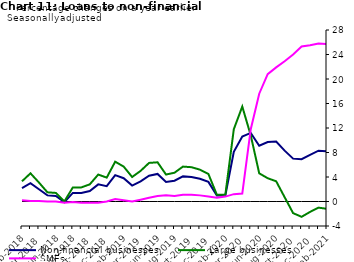
| Category | zero | Non-financial businesses | Large businesses | SMEs |
|---|---|---|---|---|
| Feb-2018 | 0 | 2.2 | 3.3 | 0.2 |
| Mar-2018 | 0 | 3 | 4.6 | 0.1 |
| Apr-2018 | 0 | 2 | 3.1 | 0.1 |
| May-2018 | 0 | 1 | 1.5 | 0 |
| Jun-2018 | 0 | 0.9 | 1.4 | 0 |
| Jul-2018 | 0 | -0.1 | 0 | -0.2 |
| Aug-2018 | 0 | 1.4 | 2.3 | -0.1 |
| Sep-2018 | 0 | 1.4 | 2.3 | -0.2 |
| Oct-2018 | 0 | 1.7 | 2.8 | -0.2 |
| Nov-2018 | 0 | 2.8 | 4.4 | -0.2 |
| Dec-2018 | 0 | 2.5 | 3.9 | 0 |
| Jan-2019 | 0 | 4.3 | 6.5 | 0.4 |
| Feb-2019 | 0 | 3.8 | 5.7 | 0.2 |
| Mar-2019 | 0 | 2.6 | 4 | 0 |
| Apr-2019 | 0 | 3.3 | 5 | 0.3 |
| May-2019 | 0 | 4.2 | 6.3 | 0.6 |
| Jun-2019 | 0 | 4.5 | 6.4 | 0.9 |
| Jul-2019 | 0 | 3.2 | 4.4 | 1 |
| Aug-2019 | 0 | 3.4 | 4.7 | 0.9 |
| Sep-2019 | 0 | 4.1 | 5.7 | 1.1 |
| Oct-2019 | 0 | 4 | 5.6 | 1.1 |
| Nov-2019 | 0 | 3.7 | 5.2 | 1 |
| Dec-2019 | 0 | 3.2 | 4.5 | 0.8 |
| Jan-2020 | 0 | 1 | 1.1 | 0.6 |
| Feb-2020 | 0 | 1 | 1.1 | 0.8 |
| Mar-2020 | 0 | 8.1 | 11.8 | 1.2 |
| Apr-2020 | 0 | 10.6 | 15.5 | 1.3 |
| May-2020 | 0 | 11.2 | 10.8 | 11.8 |
| Jun-2020 | 0 | 9.1 | 4.6 | 17.6 |
| Jul-2020 | 0 | 9.7 | 3.8 | 20.8 |
| Aug-2020 | 0 | 9.8 | 3.3 | 21.9 |
| Sep-2020 | 0 | 8.3 | 0.7 | 22.9 |
| Oct-2020 | 0 | 7 | -1.9 | 24 |
| Nov-2020 | 0 | 6.9 | -2.5 | 25.3 |
| Dec-2020 | 0 | 7.6 | -1.7 | 25.5 |
| Jan-2021 | 0 | 8.3 | -1 | 25.8 |
| Feb-2021 | 0 | 8.2 | -1.2 | 25.7 |